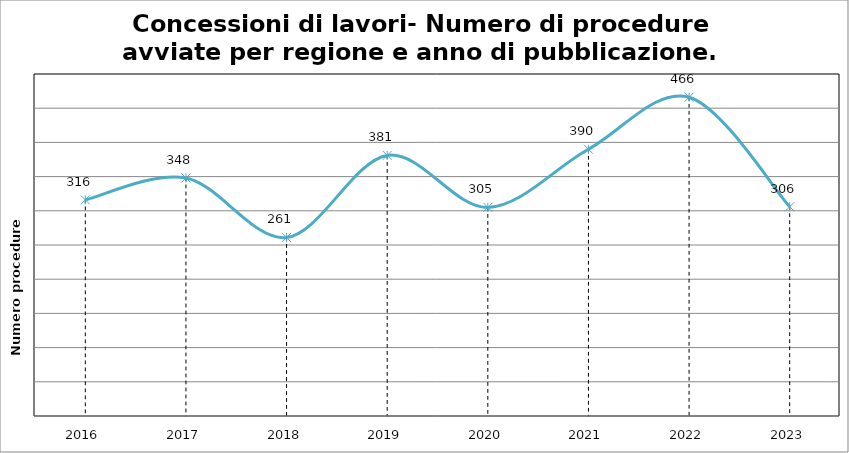
| Category | Totale |
|---|---|
| 2016.0 | 316 |
| 2017.0 | 348 |
| 2018.0 | 261 |
| 2019.0 | 381 |
| 2020.0 | 305 |
| 2021.0 | 390 |
| 2022.0 | 466 |
| 2023.0 | 306 |